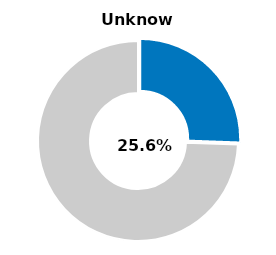
| Category | Series 0 |
|---|---|
| Unknown | 0.256 |
| Other | 0.744 |